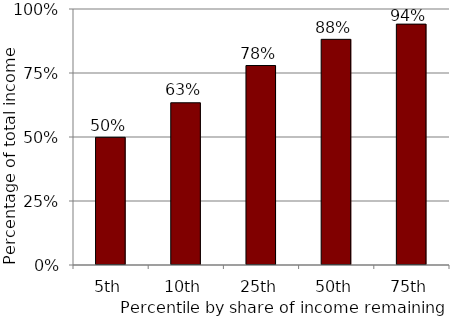
| Category | Series 0 |
|---|---|
| 5th | 0.499 |
| 10th | 0.634 |
| 25th | 0.779 |
| 50th | 0.882 |
| 75th | 0.941 |